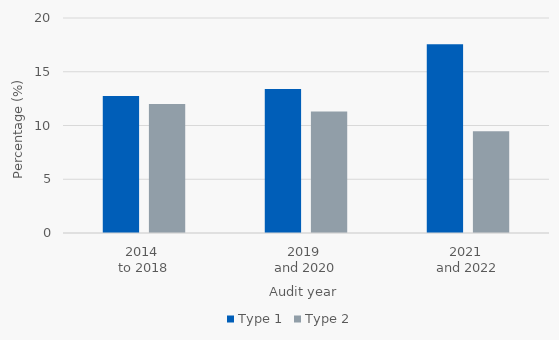
| Category | Type 1 | Type 2 |
|---|---|---|
| 2014 
to 2018 | 12.742 | 12.003 |
| 2019 
and 2020 | 13.398 | 11.314 |
| 2021 
and 2022 | 17.569 | 9.465 |